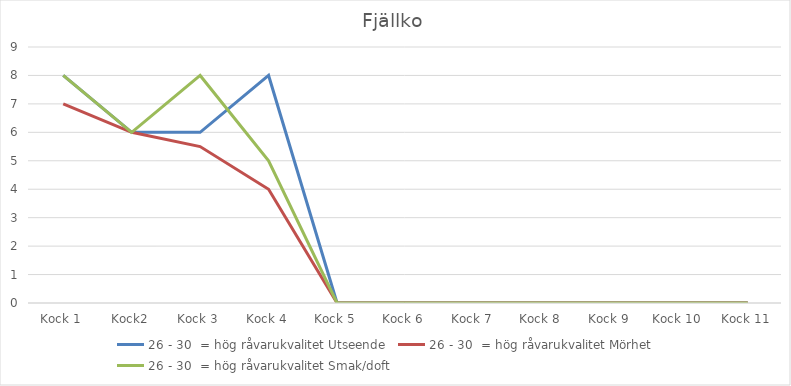
| Category | 26 - 30  = hög råvarukvalitet Utseende | 26 - 30  = hög råvarukvalitet Mörhet | 26 - 30  = hög råvarukvalitet Smak/doft |
|---|---|---|---|
| Kock 1 | 8 | 7 | 8 |
| Kock2 | 6 | 6 | 6 |
| Kock 3 | 6 | 5.5 | 8 |
| Kock 4 | 8 | 4 | 5 |
| Kock 5 | 0 | 0 | 0 |
| Kock 6 | 0 | 0 | 0 |
| Kock 7 | 0 | 0 | 0 |
| Kock 8 | 0 | 0 | 0 |
| Kock 9 | 0 | 0 | 0 |
| Kock 10 | 0 | 0 | 0 |
| Kock 11 | 0 | 0 | 0 |